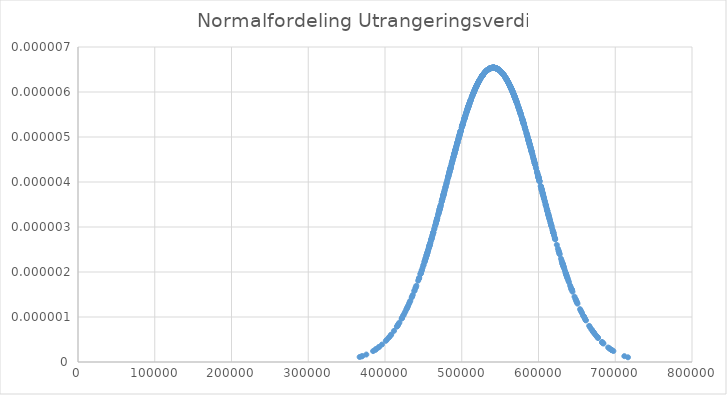
| Category | Utrangeringsverdi |
|---|---|
| 541520.6310679612 | 0 |
| 537732.5573834797 | 0 |
| 451906.3455445282 | 0 |
| 491315.9176790835 | 0 |
| 595592.844282881 | 0 |
| 606368.579503678 | 0 |
| 391740.6434773868 | 0 |
| 500350.4982229182 | 0 |
| 516397.9817985276 | 0 |
| 578602.0733846021 | 0 |
| 555588.2427538147 | 0 |
| 579235.3381616172 | 0 |
| 461228.8485122129 | 0 |
| 489516.7804666296 | 0 |
| 500866.867843444 | 0 |
| 514557.9205558146 | 0 |
| 520504.1752017381 | 0 |
| 625333.8536308418 | 0 |
| 505655.7800758812 | 0 |
| 486996.9495682554 | 0 |
| 559883.8333240089 | 0 |
| 527957.903533684 | 0 |
| 633636.7287104088 | 0 |
| 532467.5893097969 | 0 |
| 564645.8463422247 | 0 |
| 444607.3205481251 | 0 |
| 574970.3197416607 | 0 |
| 607095.81500713 | 0 |
| 631063.4264896705 | 0 |
| 573499.5959778081 | 0 |
| 525573.569729449 | 0 |
| 507932.60233585 | 0 |
| 540752.7380096193 | 0 |
| 636487.2699177825 | 0 |
| 567904.4316170356 | 0 |
| 536603.8680242125 | 0 |
| 594983.793027528 | 0 |
| 580372.8034718327 | 0 |
| 472163.6655338185 | 0 |
| 600229.3647564284 | 0 |
| 621772.766985891 | 0 |
| 589339.8698221272 | 0 |
| 494089.2778966925 | 0 |
| 484301.2439762751 | 0 |
| 568009.5168126054 | 0 |
| 619081.6915693211 | 0 |
| 565520.5089659444 | 0 |
| 532655.9245269326 | 0 |
| 596950.1977730885 | 0 |
| 620266.9206642273 | 0 |
| 604633.8328092562 | 0 |
| 500745.745302014 | 0 |
| 457385.8636421638 | 0 |
| 632144.4242045402 | 0 |
| 498665.3904425516 | 0 |
| 485004.6562259477 | 0 |
| 531313.0245153964 | 0 |
| 455194.7259074138 | 0 |
| 575374.2458821136 | 0 |
| 569349.5547800716 | 0 |
| 529675.962959383 | 0 |
| 450308.2201250925 | 0 |
| 533507.533216141 | 0 |
| 649664.9513249238 | 0 |
| 536880.9092343738 | 0 |
| 507107.2536725753 | 0 |
| 512044.1197654458 | 0 |
| 682798.8096735637 | 0 |
| 609041.4893420488 | 0 |
| 588339.7641331989 | 0 |
| 626452.7102035444 | 0 |
| 528226.9362666185 | 0 |
| 469089.1392393974 | 0 |
| 671954.3548844857 | 0 |
| 537187.6330151475 | 0 |
| 508017.524239097 | 0 |
| 478735.1553686096 | 0 |
| 568180.027431637 | 0 |
| 610685.3004700516 | 0 |
| 558917.9406612482 | 0 |
| 563500.1709820253 | 0 |
| 477028.1773530208 | 0 |
| 543418.0779364872 | 0 |
| 481605.0750991763 | 0 |
| 495542.8773954691 | 0 |
| 605663.7349789976 | 0 |
| 584475.775473506 | 0 |
| 498746.0359205088 | 0 |
| 545279.2733695072 | 0 |
| 608325.4943162088 | 0 |
| 506687.3261341173 | 0 |
| 564479.0155394555 | 0 |
| 522017.6917780117 | 0 |
| 570205.1821496913 | 0 |
| 483196.6967719862 | 0 |
| 517985.7816331886 | 0 |
| 599640.6494172452 | 0 |
| 521717.1621041826 | 0 |
| 485001.4632878537 | 0 |
| 564599.3756851942 | 0 |
| 493027.9887745639 | 0 |
| 560747.9367137383 | 0 |
| 544913.8367971675 | 0 |
| 547768.6884280432 | 0 |
| 538726.0432716712 | 0 |
| 591783.1490172257 | 0 |
| 562196.0135549067 | 0 |
| 511161.9177366151 | 0 |
| 509267.9391896227 | 0 |
| 564130.6886998743 | 0 |
| 559816.2599328177 | 0 |
| 533798.380213053 | 0 |
| 491535.5898376804 | 0 |
| 558905.6275307875 | 0 |
| 530850.0672081677 | 0 |
| 602982.9163997867 | 0 |
| 539102.2465861518 | 0 |
| 447961.5801122084 | 0 |
| 474134.8954609303 | 0 |
| 587741.06013349 | 0 |
| 536079.2938819844 | 0 |
| 565805.717779859 | 0 |
| 654159.9341399398 | 0 |
| 478655.1554632297 | 0 |
| 485411.9350368354 | 0 |
| 496398.2168696258 | 0 |
| 614906.0217747851 | 0 |
| 562989.2705221989 | 0 |
| 542500.2239981648 | 0 |
| 457543.4707115143 | 0 |
| 615725.1801066092 | 0 |
| 499929.2442768055 | 0 |
| 459963.7639857946 | 0 |
| 559864.8739290503 | 0 |
| 521408.0283310829 | 0 |
| 554820.4761096975 | 0 |
| 471242.5921832537 | 0 |
| 648635.629989911 | 0 |
| 538795.6829750249 | 0 |
| 527906.9060047473 | 0 |
| 458162.8305214415 | 0 |
| 488144.3266066121 | 0 |
| 578735.4437633717 | 0 |
| 578048.3490402427 | 0 |
| 458664.1797176892 | 0 |
| 462810.3576013183 | 0 |
| 497915.9604843986 | 0 |
| 463004.4961661178 | 0 |
| 501647.0026940301 | 0 |
| 683958.999318145 | 0 |
| 511055.7584872704 | 0 |
| 675954.4834402073 | 0 |
| 569167.3873371175 | 0 |
| 630162.1540087305 | 0 |
| 567323.957956525 | 0 |
| 482761.6520998905 | 0 |
| 619338.753467541 | 0 |
| 531482.1429532483 | 0 |
| 533948.8721624649 | 0 |
| 525203.4651069725 | 0 |
| 537045.0737901882 | 0 |
| 509422.8216328385 | 0 |
| 416964.5658691387 | 0 |
| 457950.8447581772 | 0 |
| 563087.8065930355 | 0 |
| 522779.5352779246 | 0 |
| 417770.7583924528 | 0 |
| 421992.3306509548 | 0 |
| 616712.5332281624 | 0 |
| 507193.0457702303 | 0 |
| 425494.9407111524 | 0 |
| 513497.47796937 | 0 |
| 495835.0832794923 | 0 |
| 503746.0500621831 | 0 |
| 535265.126137008 | 0 |
| 501006.4697266447 | 0 |
| 618237.7327906948 | 0 |
| 384484.8462695717 | 0 |
| 541931.240182216 | 0 |
| 475711.2637520852 | 0 |
| 476420.4259566675 | 0 |
| 501911.0347531946 | 0 |
| 552562.4961465122 | 0 |
| 582371.9950170881 | 0 |
| 570248.8890566531 | 0 |
| 531477.5955864107 | 0 |
| 544135.9775734192 | 0 |
| 592870.934048337 | 0 |
| 470788.7149920764 | 0 |
| 462861.2428922009 | 0 |
| 494366.5687097723 | 0 |
| 613503.8122341126 | 0 |
| 650315.2744064025 | 0 |
| 542494.513200383 | 0 |
| 547001.4127112674 | 0 |
| 536598.714737797 | 0 |
| 423874.2872701442 | 0 |
| 558270.5817122095 | 0 |
| 635663.753727524 | 0 |
| 451688.0139354553 | 0 |
| 585112.8739598701 | 0 |
| 518201.5940305523 | 0 |
| 494468.9504951322 | 0 |
| 518825.260108119 | 0 |
| 472850.8365540907 | 0 |
| 508056.2997129023 | 0 |
| 524747.4190894534 | 0 |
| 603192.3015063013 | 0 |
| 538774.5011419265 | 0 |
| 490171.8428878997 | 0 |
| 533210.8295581712 | 0 |
| 619353.5075259744 | 0 |
| 711835.4342649512 | 0 |
| 556437.175459468 | 0 |
| 561780.5335174184 | 0 |
| 508920.7541371138 | 0 |
| 490359.6987128282 | 0 |
| 458416.6072509396 | 0 |
| 491034.5737108312 | 0 |
| 429548.8647926782 | 0 |
| 540857.746901735 | 0 |
| 580859.7640262453 | 0 |
| 563971.531621092 | 0 |
| 443255.1082526816 | 0 |
| 512762.3643778054 | 0 |
| 637563.2359124623 | 0 |
| 533701.2638741034 | 0 |
| 591338.0709544376 | 0 |
| 580879.7162195252 | 0 |
| 535242.4883594839 | 0 |
| 586854.5386419474 | 0 |
| 611343.1647207633 | 0 |
| 485694.3800236234 | 0 |
| 600061.6557571325 | 0 |
| 506263.2000485352 | 0 |
| 581824.7838924829 | 0 |
| 635375.0794963902 | 0 |
| 511610.0912492771 | 0 |
| 466366.2640791326 | 0 |
| 456550.9905985528 | 0 |
| 502908.9486303321 | 0 |
| 429069.6104240199 | 0 |
| 630761.070398035 | 0 |
| 667151.0161707217 | 0 |
| 540570.6781056984 | 0 |
| 588210.02799184 | 0 |
| 473907.3780241444 | 0 |
| 569570.0160370643 | 0 |
| 537788.2802740887 | 0 |
| 572503.3169677733 | 0 |
| 541491.8229876152 | 0 |
| 411745.4146515756 | 0 |
| 503209.9656867537 | 0 |
| 462722.2103228326 | 0 |
| 497700.8068633001 | 0 |
| 532684.5275730438 | 0 |
| 589546.934264935 | 0 |
| 479307.3640644728 | 0 |
| 485243.2076401768 | 0 |
| 579528.4667028828 | 0 |
| 505536.7973154876 | 0 |
| 508802.5516797563 | 0 |
| 578407.7907692397 | 0 |
| 533749.8427629345 | 0 |
| 555174.8386513313 | 0 |
| 471558.1650197543 | 0 |
| 563006.0471445848 | 0 |
| 578922.62182213 | 0 |
| 548587.006727476 | 0 |
| 520235.7729395499 | 0 |
| 557313.0574428529 | 0 |
| 527667.6630117327 | 0 |
| 488553.2647086684 | 0 |
| 496731.630035795 | 0 |
| 580093.594254124 | 0 |
| 584583.4778841222 | 0 |
| 546771.6485142405 | 0 |
| 611203.8317523588 | 0 |
| 469454.093659203 | 0 |
| 513229.6097644725 | 0 |
| 590974.4219627527 | 0 |
| 562963.7141926184 | 0 |
| 551306.8498749337 | 0 |
| 643018.268842063 | 0 |
| 596596.4178023302 | 0 |
| 472094.6304877636 | 0 |
| 545578.223774648 | 0 |
| 569706.2613406328 | 0 |
| 475082.3343019253 | 0 |
| 566005.1712818267 | 0 |
| 498620.3602032409 | 0 |
| 602988.4892888906 | 0 |
| 508970.6758646247 | 0 |
| 546910.5773085046 | 0 |
| 594341.561874216 | 0 |
| 573634.0554399295 | 0 |
| 469673.6994536671 | 0 |
| 637389.5778732058 | 0 |
| 548649.3165335372 | 0 |
| 559870.3889877272 | 0 |
| 592126.0738681196 | 0 |
| 519408.7039854084 | 0 |
| 529118.9567842842 | 0 |
| 613926.653533283 | 0 |
| 616778.3809518692 | 0 |
| 467056.477489553 | 0 |
| 535651.6985289403 | 0 |
| 462013.957461536 | 0 |
| 621164.7312060901 | 0 |
| 489123.2365072172 | 0 |
| 550325.1892022733 | 0 |
| 531306.8875062356 | 0 |
| 641173.6613538197 | 0 |
| 577028.855662836 | 0 |
| 584923.261802531 | 0 |
| 495218.7539534298 | 0 |
| 528326.1186382252 | 0 |
| 558880.2863974532 | 0 |
| 601312.940764983 | 0 |
| 470211.2616538951 | 0 |
| 573185.168847868 | 0 |
| 576562.0081414199 | 0 |
| 593730.766397886 | 0 |
| 571712.1414280282 | 0 |
| 608253.1308014931 | 0 |
| 532066.635623083 | 0 |
| 643210.7075396455 | 0 |
| 492500.4105929842 | 0 |
| 464032.1872827689 | 0 |
| 490225.4800547996 | 0 |
| 598253.1232559587 | 0 |
| 438586.3852358608 | 0 |
| 455360.464889573 | 0 |
| 605848.3496668388 | 0 |
| 522438.8140471775 | 0 |
| 527158.5190725361 | 0 |
| 586803.8661966992 | 0 |
| 619230.88318774 | 0 |
| 545445.4496344267 | 0 |
| 415511.8081997087 | 0 |
| 542738.5365520066 | 0 |
| 487848.3123964228 | 0 |
| 477796.3390063812 | 0 |
| 631919.6601137051 | 0 |
| 614923.3908395033 | 0 |
| 612414.4134925646 | 0 |
| 571481.3451195194 | 0 |
| 482503.0865884545 | 0 |
| 495749.8861556998 | 0 |
| 571072.5430895805 | 0 |
| 550158.9972743792 | 0 |
| 428306.6718325688 | 0 |
| 598014.6324964454 | 0 |
| 542829.3796845262 | 0 |
| 519499.8856098265 | 0 |
| 507690.7063985387 | 0 |
| 590086.9087822295 | 0 |
| 609607.1008953908 | 0 |
| 612522.4212645895 | 0 |
| 661756.9806324206 | 0 |
| 504558.041811422 | 0 |
| 534780.355686956 | 0 |
| 435304.4703499007 | 0 |
| 563806.193331941 | 0 |
| 478940.8419735471 | 0 |
| 582205.3301142575 | 0 |
| 518957.5782645543 | 0 |
| 527245.8852554552 | 0 |
| 611018.1134383676 | 0 |
| 535526.6500100944 | 0 |
| 465339.3405185064 | 0 |
| 565811.4902951905 | 0 |
| 636155.681128112 | 0 |
| 598472.8381038018 | 0 |
| 507397.5450961937 | 0 |
| 590787.9053348242 | 0 |
| 574205.0441331492 | 0 |
| 502366.7607804266 | 0 |
| 407501.47539871 | 0 |
| 638128.9293515787 | 0 |
| 626822.239512529 | 0 |
| 673509.4268716415 | 0 |
| 526877.8544700217 | 0 |
| 552384.6832616618 | 0 |
| 467891.0727643428 | 0 |
| 520120.1250437297 | 0 |
| 546943.0599421907 | 0 |
| 618623.1174747199 | 0 |
| 465475.6680649578 | 0 |
| 520993.2561842463 | 0 |
| 454832.2221209784 | 0 |
| 515193.2480890209 | 0 |
| 631807.0929331313 | 0 |
| 580206.0713745233 | 0 |
| 457594.9770741816 | 0 |
| 573302.3035182644 | 0 |
| 510765.6058547088 | 0 |
| 523165.0493004328 | 0 |
| 549082.6994601176 | 0 |
| 577614.2281748902 | 0 |
| 562681.9121315011 | 0 |
| 561114.9559091371 | 0 |
| 614166.492552712 | 0 |
| 643351.7379967512 | 0 |
| 526054.8261810882 | 0 |
| 551791.0438357485 | 0 |
| 494457.275208296 | 0 |
| 585746.9319294667 | 0 |
| 546052.9733667406 | 0 |
| 535921.8365240637 | 0 |
| 453096.595302724 | 0 |
| 528379.1270543771 | 0 |
| 644307.1225009251 | 0 |
| 569564.2666225889 | 0 |
| 548191.5712675292 | 0 |
| 484091.4159025007 | 0 |
| 476340.5793305445 | 0 |
| 476754.7089814726 | 0 |
| 563607.9976298522 | 0 |
| 546111.8104450206 | 0 |
| 517604.0692513342 | 0 |
| 541563.826286153 | 0 |
| 586347.9113244693 | 0 |
| 517214.1047248128 | 0 |
| 692356.79767832 | 0 |
| 387485.9031282746 | 0 |
| 558334.8859763782 | 0 |
| 501357.6873148324 | 0 |
| 475831.7292809292 | 0 |
| 672132.8019392478 | 0 |
| 565701.7187595727 | 0 |
| 587606.4715982327 | 0 |
| 583225.5963342784 | 0 |
| 527979.953965902 | 0 |
| 694940.6259770007 | 0 |
| 547068.9284959043 | 0 |
| 569409.2273296511 | 0 |
| 554302.8453337963 | 0 |
| 474768.9462693906 | 0 |
| 570774.0656756337 | 0 |
| 579549.6214590307 | 0 |
| 550279.7475361701 | 0 |
| 426676.999697824 | 0 |
| 619118.7252739086 | 0 |
| 492680.767284879 | 0 |
| 415937.656027256 | 0 |
| 660388.6502929654 | 0 |
| 558316.4371824178 | 0 |
| 540466.3435369888 | 0 |
| 595212.0298278687 | 0 |
| 460543.4854867755 | 0 |
| 600132.391753986 | 0 |
| 504089.075587714 | 0 |
| 658707.9521999035 | 0 |
| 460305.7408363419 | 0 |
| 589704.8031136994 | 0 |
| 604205.9638741413 | 0 |
| 408083.7383116107 | 0 |
| 526717.0696181018 | 0 |
| 458835.9171245114 | 0 |
| 585604.5161776413 | 0 |
| 567618.0306413596 | 0 |
| 574523.5542774487 | 0 |
| 523844.5812144576 | 0 |
| 471295.5530738098 | 0 |
| 598961.9612632717 | 0 |
| 537120.2043328655 | 0 |
| 498344.3289259484 | 0 |
| 515142.3625508355 | 0 |
| 592669.9216246546 | 0 |
| 613298.1591692124 | 0 |
| 605284.0998600974 | 0 |
| 575510.2501327955 | 0 |
| 638892.1662852234 | 0 |
| 676531.917814635 | 0 |
| 559275.3565485294 | 0 |
| 536010.8016370998 | 0 |
| 459210.5533906978 | 0 |
| 564785.2680264227 | 0 |
| 621671.9208228973 | 0 |
| 531222.0651006668 | 0 |
| 514432.2615255805 | 0 |
| 535346.6416812754 | 0 |
| 552501.7278567712 | 0 |
| 446231.991434354 | 0 |
| 516340.816843783 | 0 |
| 487265.4773518984 | 0 |
| 484817.1085124073 | 0 |
| 535865.589016808 | 0 |
| 485080.3088256712 | 0 |
| 539635.061843878 | 0 |
| 660674.503314375 | 0 |
| 482571.427182682 | 0 |
| 631493.8153115357 | 0 |
| 548349.280454092 | 0 |
| 461843.8651596602 | 0 |
| 530158.2588625595 | 0 |
| 631652.8802037528 | 0 |
| 454610.9659460875 | 0 |
| 440836.3532266566 | 0 |
| 577105.8862516767 | 0 |
| 538439.8930631508 | 0 |
| 538156.4128076173 | 0 |
| 491861.416611645 | 0 |
| 552675.8923707088 | 0 |
| 562370.3801349422 | 0 |
| 477845.1834940688 | 0 |
| 650810.600335467 | 0 |
| 574321.8361681723 | 0 |
| 530297.8601058337 | 0 |
| 529339.9226922627 | 0 |
| 520144.3261032653 | 0 |
| 511756.9320935667 | 0 |
| 366948.9407635547 | 0 |
| 521572.1990321254 | 0 |
| 490211.1237357627 | 0 |
| 508521.1179881367 | 0 |
| 534933.2997431876 | 0 |
| 518321.8397167051 | 0 |
| 613677.2174871628 | 0 |
| 498058.6155352462 | 0 |
| 587172.7868047971 | 0 |
| 563335.9412188584 | 0 |
| 474576.3201822414 | 0 |
| 612852.9485014006 | 0 |
| 558461.3531053214 | 0 |
| 525230.5049102486 | 0 |
| 610024.4776994804 | 0 |
| 496391.9152413133 | 0 |
| 515550.542121908 | 0 |
| 540586.1255376015 | 0 |
| 543761.727691303 | 0 |
| 642964.4421394974 | 0 |
| 595122.8006154248 | 0 |
| 535166.0268018976 | 0 |
| 544091.5026928135 | 0 |
| 470147.7698118247 | 0 |
| 449016.1413286161 | 0 |
| 511052.4392827176 | 0 |
| 491579.2180122163 | 0 |
| 690807.7613844397 | 0 |
| 588679.1754284981 | 0 |
| 632523.5347331245 | 0 |
| 619191.8380822897 | 0 |
| 568373.4439278612 | 0 |
| 562438.720315615 | 0 |
| 612778.5655366333 | 0 |
| 542873.6988994081 | 0 |
| 486651.9440820945 | 0 |
| 568459.2625053716 | 0 |
| 590603.3574303635 | 0 |
| 569131.1522510753 | 0 |
| 576572.2791395946 | 0 |
| 611760.3368940587 | 0 |
| 582468.1430433356 | 0 |
| 569003.033233317 | 0 |
| 502963.6070184136 | 0 |
| 449935.8360937324 | 0 |
| 557854.5206162994 | 0 |
| 527760.7550604955 | 0 |
| 489228.6543392497 | 0 |
| 534304.4985605176 | 0 |
| 444348.0978728731 | 0 |
| 455098.2418601835 | 0 |
| 529605.1801908036 | 0 |
| 544930.701749943 | 0 |
| 529747.1344514372 | 0 |
| 501433.513729675 | 0 |
| 564242.2205642054 | 0 |
| 587094.303865741 | 0 |
| 521814.7898889193 | 0 |
| 537591.0766745886 | 0 |
| 535101.6256804126 | 0 |
| 548807.8389604985 | 0 |
| 485922.163442599 | 0 |
| 580727.5302426021 | 0 |
| 370453.0720770531 | 0 |
| 609552.9180156062 | 0 |
| 587347.2319793461 | 0 |
| 658482.3430368355 | 0 |
| 432204.141158787 | 0 |
| 456069.85887041 | 0 |
| 627589.2111528673 | 0 |
| 564796.9258119188 | 0 |
| 603528.4449697924 | 0 |
| 483441.2131674015 | 0 |
| 576257.7779165583 | 0 |
| 582537.7622813921 | 0 |
| 564437.6268754294 | 0 |
| 508592.6090764105 | 0 |
| 683554.0225748813 | 0 |
| 487306.1707386784 | 0 |
| 537849.1514372425 | 0 |
| 615772.422038327 | 0 |
| 541032.4536078847 | 0 |
| 576092.1558791255 | 0 |
| 553853.0599905172 | 0 |
| 497199.8871976445 | 0 |
| 692886.7445046953 | 0 |
| 646925.486023862 | 0 |
| 552785.6270801607 | 0 |
| 491521.8359028165 | 0 |
| 482217.4576036329 | 0 |
| 537513.5798778047 | 0 |
| 418768.8421673804 | 0 |
| 566391.9653599628 | 0 |
| 551753.518377923 | 0 |
| 519052.8706338533 | 0 |
| 527834.812580288 | 0 |
| 532465.588794789 | 0 |
| 552906.8652431358 | 0 |
| 526367.0847284032 | 0 |
| 553306.9094364227 | 0 |
| 601422.7949684155 | 0 |
| 565095.1551778086 | 0 |
| 548442.5825629762 | 0 |
| 550765.1315491137 | 0 |
| 593707.134006473 | 0 |
| 494058.7109523241 | 0 |
| 489018.8838400241 | 0 |
| 522833.8933491688 | 0 |
| 556418.4439999629 | 0 |
| 526527.845915183 | 0 |
| 402553.2187673787 | 0 |
| 583170.7213379692 | 0 |
| 669077.1629296031 | 0 |
| 454153.315396109 | 0 |
| 538518.6539998233 | 0 |
| 506624.6990576264 | 0 |
| 604113.6070021293 | 0 |
| 490542.4140250656 | 0 |
| 517151.6843409604 | 0 |
| 616619.9164119008 | 0 |
| 682833.535322509 | 0 |
| 454112.5192429835 | 0 |
| 606021.3102792361 | 0 |
| 607097.371605823 | 0 |
| 567993.8137317923 | 0 |
| 544351.4037395152 | 0 |
| 612640.6367274394 | 0 |
| 475766.2829257687 | 0 |
| 522003.3890507594 | 0 |
| 587011.9055679925 | 0 |
| 484286.405205693 | 0 |
| 528281.3322665804 | 0 |
| 504187.4389052748 | 0 |
| 447911.1778881133 | 0 |
| 535797.276639662 | 0 |
| 487275.0637343465 | 0 |
| 557026.3460303016 | 0 |
| 527132.7664400642 | 0 |
| 541493.689048382 | 0 |
| 530751.8543663443 | 0 |
| 568197.4602980522 | 0 |
| 551888.907256936 | 0 |
| 510209.6905803889 | 0 |
| 549780.8363616354 | 0 |
| 675015.074698035 | 0 |
| 590717.0078128888 | 0 |
| 444220.6453741691 | 0 |
| 677580.240502173 | 0 |
| 542030.1213055718 | 0 |
| 481052.6991204084 | 0 |
| 557940.688235014 | 0 |
| 632246.5901299112 | 0 |
| 531082.7758099643 | 0 |
| 620107.164775194 | 0 |
| 580797.467820785 | 0 |
| 568890.5762371226 | 0 |
| 500886.9314796737 | 0 |
| 523381.3361891257 | 0 |
| 452312.22266295 | 0 |
| 491263.0027419607 | 0 |
| 476933.3129545598 | 0 |
| 670955.4663695728 | 0 |
| 438199.7696688196 | 0 |
| 491702.3740047115 | 0 |
| 605185.766793529 | 0 |
| 571243.1554430712 | 0 |
| 507846.5310142382 | 0 |
| 562361.758694766 | 0 |
| 623880.0508121283 | 0 |
| 534673.8281503936 | 0 |
| 601162.9272434762 | 0 |
| 697571.0517159963 | 0 |
| 609456.0119466981 | 0 |
| 533190.4986076958 | 0 |
| 538020.0704656678 | 0 |
| 658537.7893411894 | 0 |
| 432962.0491256281 | 0 |
| 451886.3894062515 | 0 |
| 586136.0955670273 | 0 |
| 477290.7112465119 | 0 |
| 471439.2523220448 | 0 |
| 538902.5126309 | 0 |
| 480539.1365605837 | 0 |
| 472549.8961809191 | 0 |
| 518996.025867515 | 0 |
| 539214.479943004 | 0 |
| 431345.7790221724 | 0 |
| 561183.0067374664 | 0 |
| 554370.2683699545 | 0 |
| 518918.2966375445 | 0 |
| 491216.3137504804 | 0 |
| 483814.7964833406 | 0 |
| 525551.275076407 | 0 |
| 446572.5057221416 | 0 |
| 550911.3699167086 | 0 |
| 474399.9063799225 | 0 |
| 588373.865242709 | 0 |
| 388222.335560293 | 0 |
| 603873.6110530605 | 0 |
| 631702.2200981239 | 0 |
| 452865.2848530567 | 0 |
| 616291.479763438 | 0 |
| 496828.3353233325 | 0 |
| 530247.1974486134 | 0 |
| 661471.435896429 | 0 |
| 476058.8104138413 | 0 |
| 545827.8382300086 | 0 |
| 639571.064097387 | 0 |
| 594162.9495947952 | 0 |
| 544161.9450071692 | 0 |
| 440104.3360680448 | 0 |
| 525954.4581824245 | 0 |
| 392103.7654648517 | 0 |
| 504344.5365488843 | 0 |
| 466224.8567764619 | 0 |
| 599800.504021239 | 0 |
| 572425.117587683 | 0 |
| 591098.4093931094 | 0 |
| 532276.990730022 | 0 |
| 471066.5048588897 | 0 |
| 536025.0783174846 | 0 |
| 666024.065522074 | 0 |
| 513928.6178823985 | 0 |
| 564186.9301049198 | 0 |
| 599626.4002779778 | 0 |
| 516466.964590066 | 0 |
| 509399.2684062927 | 0 |
| 716590.5339946946 | 0 |
| 533103.6759456851 | 0 |
| 578958.8831599011 | 0 |
| 455952.6692210038 | 0 |
| 493628.0835179785 | 0 |
| 579151.8100699243 | 0 |
| 521553.6551957221 | 0 |
| 579852.4887640849 | 0 |
| 605956.270651656 | 0 |
| 542331.444274534 | 0 |
| 508817.825431691 | 0 |
| 428057.4689816261 | 0 |
| 526021.3018398463 | 0 |
| 543808.147045531 | 0 |
| 570889.8557090663 | 0 |
| 593238.2347050676 | 0 |
| 447001.78523112 | 0 |
| 537637.166275151 | 0 |
| 387782.4695703634 | 0 |
| 567013.1594191646 | 0 |
| 604243.7791104143 | 0 |
| 576358.013580139 | 0 |
| 543112.395333919 | 0 |
| 582393.5102703176 | 0 |
| 458105.9091856064 | 0 |
| 632995.5416520705 | 0 |
| 504543.6503233985 | 0 |
| 659190.5940280667 | 0 |
| 506676.6003487085 | 0 |
| 581144.3550496438 | 0 |
| 546524.5837808645 | 0 |
| 535351.8660963225 | 0 |
| 515984.5023773323 | 0 |
| 534866.006518629 | 0 |
| 468182.1875559924 | 0 |
| 632967.8620122846 | 0 |
| 542039.0558668528 | 0 |
| 557536.6975998182 | 0 |
| 533379.2596636747 | 0 |
| 492901.8023417387 | 0 |
| 500101.2573162033 | 0 |
| 503688.8586917603 | 0 |
| 590141.2826186805 | 0 |
| 600537.6750708113 | 0 |
| 535509.35823727 | 0 |
| 497371.7626400489 | 0 |
| 505437.7075551111 | 0 |
| 600169.1534770207 | 0 |
| 649258.3443532776 | 0 |
| 594314.7667211955 | 0 |
| 405736.1133150569 | 0 |
| 534190.5114261198 | 0 |
| 562532.383421321 | 0 |
| 515037.3068732497 | 0 |
| 563503.6811732335 | 0 |
| 483587.1989025936 | 0 |
| 532434.9969949992 | 0 |
| 569940.907891544 | 0 |
| 537071.314535582 | 0 |
| 648044.756693343 | 0 |
| 369385.2988636303 | 0 |
| 669416.8441289437 | 0 |
| 511479.5426227632 | 0 |
| 614385.9832973286 | 0 |
| 513816.3364198961 | 0 |
| 557880.1035947755 | 0 |
| 557961.1072155236 | 0 |
| 540320.146223466 | 0 |
| 611401.7419786677 | 0 |
| 563757.4198273976 | 0 |
| 503624.2069314227 | 0 |
| 476312.8781738151 | 0 |
| 584030.8479883505 | 0 |
| 629349.0369370116 | 0 |
| 607047.2000442157 | 0 |
| 503357.8308581198 | 0 |
| 542927.0424389293 | 0 |
| 546982.5837564399 | 0 |
| 568271.561646673 | 0 |
| 631519.5443671264 | 0 |
| 554528.318631599 | 0 |
| 454123.692462102 | 0 |
| 637020.9693727986 | 0 |
| 560634.8851754859 | 0 |
| 517433.768642479 | 0 |
| 531426.36057038 | 0 |
| 492193.9403531167 | 0 |
| 541187.1358397021 | 0 |
| 564577.8167753913 | 0 |
| 546282.3773912296 | 0 |
| 566470.6823359884 | 0 |
| 532913.5081272642 | 0 |
| 568172.3855506331 | 0 |
| 396058.2227707197 | 0 |
| 695566.9395076443 | 0 |
| 655939.310862427 | 0 |
| 571745.1942467081 | 0 |
| 571078.076996948 | 0 |
| 515211.2133715863 | 0 |
| 537404.5955651005 | 0 |
| 482220.2455614125 | 0 |
| 471867.0458119114 | 0 |
| 575892.0028387487 | 0 |
| 540035.4694226682 | 0 |
| 526525.4035297264 | 0 |
| 595674.2718248677 | 0 |
| 579585.3427236337 | 0 |
| 498833.1840606323 | 0 |
| 508430.2502122964 | 0 |
| 553795.463512046 | 0 |
| 521039.6287297588 | 0 |
| 606777.069368133 | 0 |
| 550799.9157421198 | 0 |
| 585133.9593421156 | 0 |
| 421849.6946112934 | 0 |
| 541983.523205306 | 0 |
| 531666.3221967821 | 0 |
| 635784.9577101156 | 0 |
| 601093.4991295333 | 0 |
| 460398.6348623408 | 0 |
| 695624.784346988 | 0 |
| 564400.3085935264 | 0 |
| 568665.4553059402 | 0 |
| 509784.2640848387 | 0 |
| 535828.254245237 | 0 |
| 480046.054119794 | 0 |
| 451263.2926894065 | 0 |
| 560577.183955352 | 0 |
| 599302.1872589509 | 0 |
| 545338.01775183 | 0 |
| 550795.5913302165 | 0 |
| 566935.3578592571 | 0 |
| 605765.0317624267 | 0 |
| 498610.6314842947 | 0 |
| 467816.6965562433 | 0 |
| 561188.1997618787 | 0 |
| 567952.2467222566 | 0 |
| 504434.2591059181 | 0 |
| 541490.757268782 | 0 |
| 510127.3182103343 | 0 |
| 487630.6775228629 | 0 |
| 505592.1095637195 | 0 |
| 496367.4879663562 | 0 |
| 401069.6888347171 | 0 |
| 422296.233017936 | 0 |
| 404955.5355417333 | 0 |
| 635921.3652018493 | 0 |
| 460892.7627942323 | 0 |
| 528651.4314832367 | 0 |
| 617534.7440610959 | 0 |
| 508542.4759069582 | 0 |
| 540066.5041246077 | 0 |
| 375690.2952105368 | 0 |
| 517375.3434694969 | 0 |
| 542507.1624552828 | 0 |
| 588681.0487190811 | 0 |
| 471533.1777389692 | 0 |
| 475669.0870457587 | 0 |
| 526600.0856308824 | 0 |
| 684635.849587594 | 0 |
| 607622.7526109979 | 0 |
| 430242.078885321 | 0 |
| 505095.4057497037 | 0 |
| 594982.7990497749 | 0 |
| 505721.5839796203 | 0 |
| 574086.3808982805 | 0 |
| 604414.268142133 | 0 |
| 543644.5125737926 | 0 |
| 553326.9870721968 | 0 |
| 446373.4326583477 | 0 |
| 484977.7024675189 | 0 |
| 631721.5992337813 | 0 |
| 493712.228813152 | 0 |
| 656610.5931571088 | 0 |
| 434817.1572349148 | 0 |
| 457020.5514136082 | 0 |
| 538985.7086971004 | 0 |
| 565192.372148332 | 0 |
| 621492.5686639363 | 0 |
| 467050.2156271873 | 0 |
| 587826.7622832595 | 0 |
| 566961.8604715205 | 0 |
| 467747.6269208102 | 0 |
| 554371.8242804474 | 0 |
| 528429.3019679498 | 0 |
| 569107.0732981032 | 0 |
| 513116.3982097034 | 0 |
| 534430.4734809448 | 0 |
| 529169.735776731 | 0 |
| 655119.9082074523 | 0 |
| 541504.3899141871 | 0 |
| 500736.4664802377 | 0 |
| 535987.096056008 | 0 |
| 566875.9302060767 | 0 |
| 508936.3545742694 | 0 |
| 519628.1348590345 | 0 |
| 473793.5384748311 | 0 |
| 671230.4405946468 | 0 |
| 677363.4167979734 | 0 |
| 538471.1206292775 | 0 |
| 557197.8052786571 | 0 |
| 570182.302762317 | 0 |
| 634529.6243476509 | 0 |
| 563039.0489789101 | 0 |
| 568424.3225564999 | 0 |
| 486037.7192674265 | 0 |
| 530014.3688342178 | 0 |
| 467630.0381291063 | 0 |
| 424065.4190682788 | 0 |
| 439755.0176932451 | 0 |
| 416651.6390081603 | 0 |
| 497678.5343866255 | 0 |
| 548086.5851847503 | 0 |
| 605544.0762392078 | 0 |
| 554787.2898817542 | 0 |
| 526783.0980244905 | 0 |
| 535465.0714836447 | 0 |
| 599487.0287051528 | 0 |
| 470473.7315214554 | 0 |
| 627241.2152150437 | 0 |
| 584999.7309134103 | 0 |
| 524608.2742825175 | 0 |
| 515249.4826720493 | 0 |
| 539122.2491040071 | 0 |
| 532941.1840512089 | 0 |
| 536985.141049148 | 0 |
| 574990.3004244033 | 0 |
| 467439.6115401044 | 0 |
| 513502.2425907831 | 0 |
| 518542.0141089444 | 0 |
| 547844.2531084243 | 0 |
| 605925.3483781231 | 0 |
| 540444.0110469544 | 0 |
| 506142.5100274732 | 0 |
| 496972.0819745718 | 0 |
| 566121.9963228084 | 0 |
| 626045.1767097082 | 0 |
| 536796.537437545 | 0 |
| 496602.7460266105 | 0 |
| 642024.8975798042 | 0 |
| 466350.715151052 | 0 |
| 515115.4695534164 | 0 |
| 563012.9631152155 | 0 |
| 580385.0197736828 | 0 |
| 526853.4263666277 | 0 |
| 530234.235589178 | 0 |
| 516285.0126266988 | 0 |
| 555722.1064039697 | 0 |
| 551258.1619340783 | 0 |
| 588759.402624524 | 0 |
| 536419.279674367 | 0 |
| 589204.9036506584 | 0 |
| 453086.8182646133 | 0 |
| 509902.7308874972 | 0 |
| 509724.5887304472 | 0 |
| 464421.8029764892 | 0 |
| 480031.7049544133 | 0 |
| 436139.5997639878 | 0 |
| 490605.0696302701 | 0 |
| 503637.383583534 | 0 |
| 520546.2995692711 | 0 |